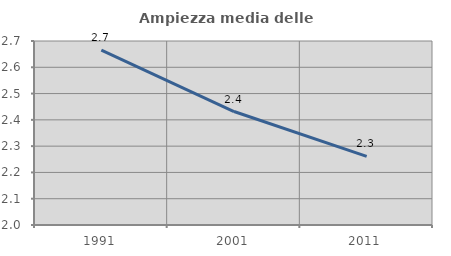
| Category | Ampiezza media delle famiglie |
|---|---|
| 1991.0 | 2.665 |
| 2001.0 | 2.432 |
| 2011.0 | 2.261 |